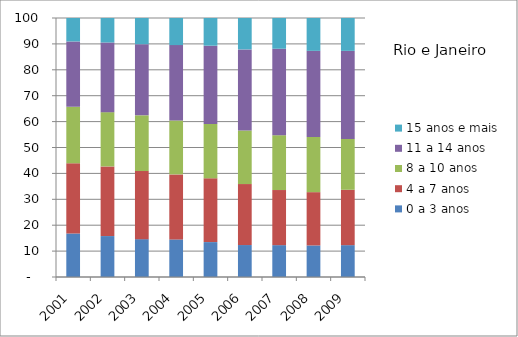
| Category | 0 a 3 anos | 4 a 7 anos | 8 a 10 anos | 11 a 14 anos | 15 anos e mais |
|---|---|---|---|---|---|
| 2001.0 | 16.8 | 27.11 | 21.81 | 25.23 | 9.05 |
| 2002.0 | 15.8 | 26.9 | 20.95 | 26.89 | 9.46 |
| 2003.0 | 14.62 | 26.29 | 21.51 | 27.46 | 10.13 |
| 2004.0 | 14.51 | 25.11 | 20.83 | 29.09 | 10.46 |
| 2005.0 | 13.47 | 24.64 | 20.97 | 30.23 | 10.7 |
| 2006.0 | 12.34 | 23.55 | 20.68 | 31.3 | 12.13 |
| 2007.0 | 12.3 | 21.28 | 21.16 | 33.39 | 11.88 |
| 2008.0 | 12.19 | 20.57 | 21.29 | 33.27 | 12.68 |
| 2009.0 | 12.3 | 21.38 | 19.63 | 33.99 | 12.7 |